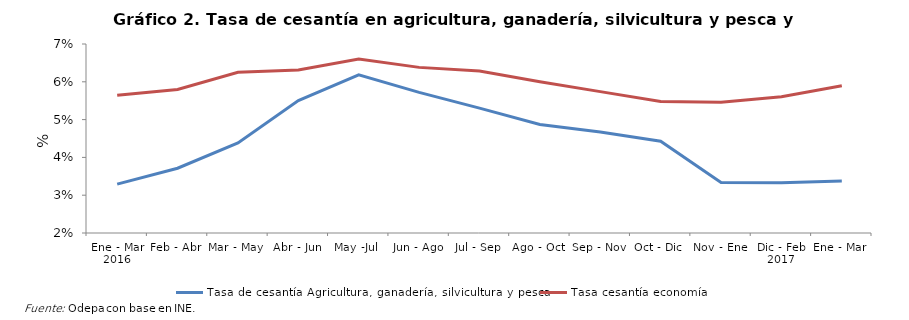
| Category | Tasa de cesantía Agricultura, ganadería, silvicultura y pesca |
|---|---|
| 0 | 0.033 |
| 1 | 0.037 |
| 2 | 0.044 |
| 3 | 0.055 |
| 4 | 0.062 |
| 5 | 0.057 |
| 6 | 0.053 |
| 7 | 0.049 |
| 8 | 0.047 |
| 9 | 0.044 |
| 10 | 0.033 |
| 11 | 0.033 |
| 12 | 0.034 |